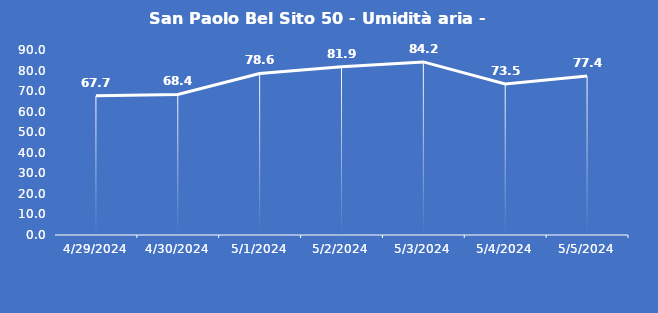
| Category | San Paolo Bel Sito 50 - Umidità aria - Grezzo (%) |
|---|---|
| 4/29/24 | 67.7 |
| 4/30/24 | 68.4 |
| 5/1/24 | 78.6 |
| 5/2/24 | 81.9 |
| 5/3/24 | 84.2 |
| 5/4/24 | 73.5 |
| 5/5/24 | 77.4 |